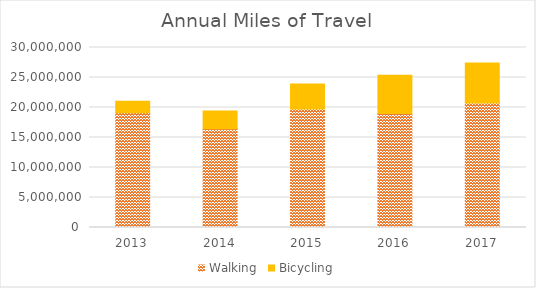
| Category | Walking | Bicycling |
|---|---|---|
| 2013 | 19110934.926 | 1934387.712 |
| 2014 | 16463293.785 | 2935896.744 |
| 2015 | 19748572.907 | 4166654.869 |
| 2016 | 18998491.223 | 6374967.608 |
| 2017 | 20735368.207 | 6682070.62 |